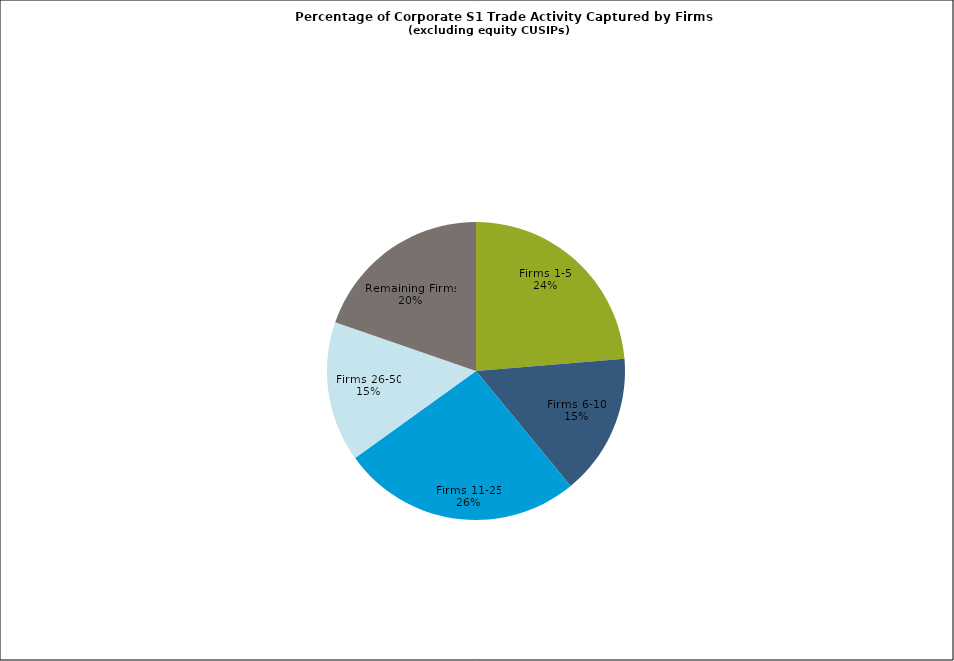
| Category | Series 0 |
|---|---|
| Firms 1-5 | 0.237 |
| Firms 6-10 | 0.153 |
| Firms 11-25 | 0.26 |
| Firms 26-50 | 0.152 |
| Remaining Firms | 0.197 |